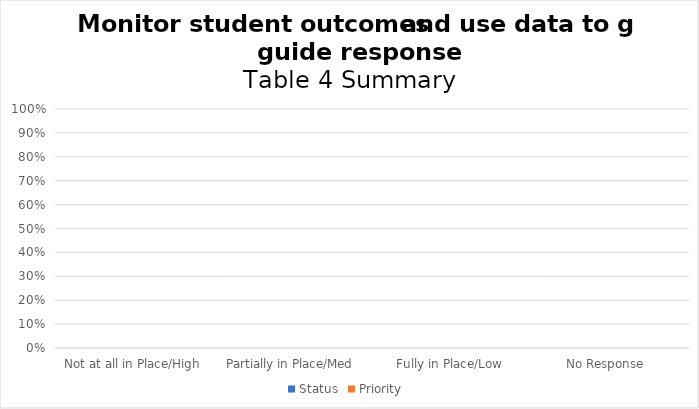
| Category | Status | Priority  |
|---|---|---|
| Not at all in Place/High | 0 | 0 |
| Partially in Place/Med | 0 | 0 |
| Fully in Place/Low | 0 | 0 |
| No Response  | 0 | 0 |